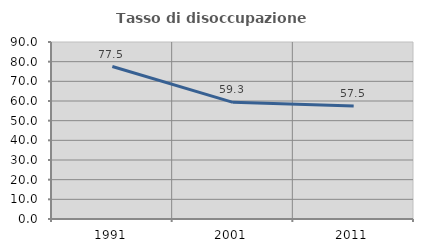
| Category | Tasso di disoccupazione giovanile  |
|---|---|
| 1991.0 | 77.535 |
| 2001.0 | 59.316 |
| 2011.0 | 57.471 |